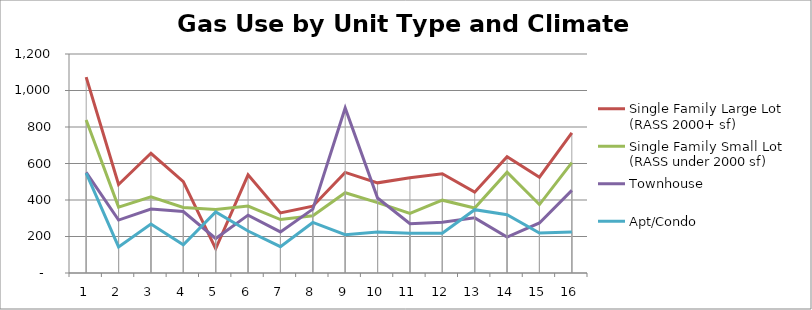
| Category | Single Family Large Lot
(RASS 2000+ sf) | Single Family Small Lot
(RASS under 2000 sf) | Townhouse | Apt/Condo |
|---|---|---|---|---|
| 1.0 | 1073 | 838 | 551 | 547 |
| 2.0 | 485 | 361 | 290 | 143 |
| 3.0 | 656 | 417 | 350 | 268 |
| 4.0 | 501 | 359 | 337 | 155 |
| 5.0 | 133 | 348 | 189 | 335 |
| 6.0 | 538 | 367 | 317 | 230 |
| 7.0 | 329 | 293 | 225 | 144 |
| 8.0 | 366 | 314 | 350 | 277 |
| 9.0 | 551 | 440 | 904 | 210 |
| 10.0 | 494 | 386 | 411 | 225 |
| 11.0 | 522 | 326 | 270 | 218 |
| 12.0 | 544 | 399 | 278 | 218 |
| 13.0 | 443 | 356 | 302 | 347 |
| 14.0 | 637 | 552 | 197 | 319 |
| 15.0 | 525 | 375 | 274 | 219 |
| 16.0 | 768 | 605 | 453 | 224 |